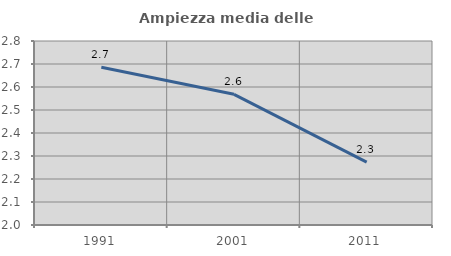
| Category | Ampiezza media delle famiglie |
|---|---|
| 1991.0 | 2.686 |
| 2001.0 | 2.568 |
| 2011.0 | 2.274 |